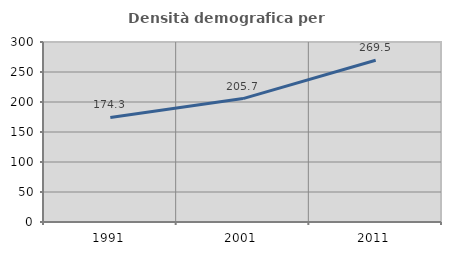
| Category | Densità demografica |
|---|---|
| 1991.0 | 174.317 |
| 2001.0 | 205.697 |
| 2011.0 | 269.476 |